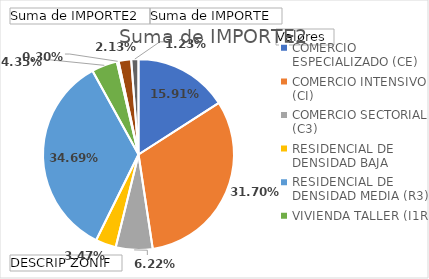
| Category | Suma de IMPORTE2 | Suma de IMPORTE |
|---|---|---|
| COMERCIO ESPECIALIZADO (CE) | 0.159 | 14829.39 |
| COMERCIO INTENSIVO (CI) | 0.317 | 29552.59 |
| COMERCIO SECTORIAL (C3) | 0.062 | 5801.75 |
| RESIDENCIAL DE DENSIDAD BAJA | 0.035 | 3235.21 |
| RESIDENCIAL DE DENSIDAD MEDIA (R3) | 0.347 | 32332.52 |
| VIVIENDA TALLER (I1R) | 0.044 | 4056.51 |
| ZONA DE RECREACIÓN TURISTICA (ZRT) | 0.003 | 277.16 |
| ZONAS DE INDUSTRIA ELEMENTAL (I1) | 0.021 | 1981.89 |
| COMERCIO ZONAL (CZ) | 0.012 | 1146.25 |